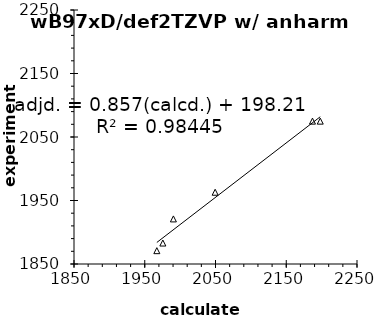
| Category | Series 0 |
|---|---|
| 1967.08 | 1871 |
| 1975.58 | 1883 |
| 1990.494 | 1921 |
| 2049.513 | 1963 |
| 2187.079 | 2075 |
| 2198.049 | 2075 |